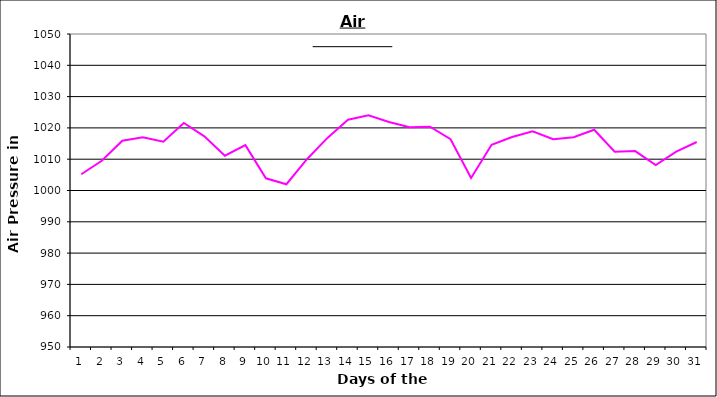
| Category | Series 0 |
|---|---|
| 0 | 1005.2 |
| 1 | 1009.5 |
| 2 | 1015.9 |
| 3 | 1017 |
| 4 | 1015.6 |
| 5 | 1021.6 |
| 6 | 1017.3 |
| 7 | 1011.1 |
| 8 | 1014.5 |
| 9 | 1003.9 |
| 10 | 1002 |
| 11 | 1010 |
| 12 | 1016.8 |
| 13 | 1022.6 |
| 14 | 1024 |
| 15 | 1021.9 |
| 16 | 1020.2 |
| 17 | 1020.4 |
| 18 | 1016.4 |
| 19 | 1004 |
| 20 | 1014.6 |
| 21 | 1017.1 |
| 22 | 1018.9 |
| 23 | 1016.4 |
| 24 | 1017 |
| 25 | 1019.4 |
| 26 | 1012.4 |
| 27 | 1012.6 |
| 28 | 1008.1 |
| 29 | 1012.4 |
| 30 | 1015.5 |